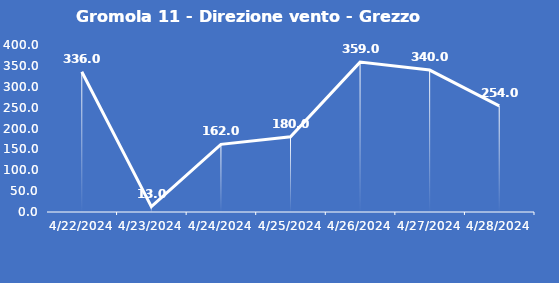
| Category | Gromola 11 - Direzione vento - Grezzo (°N) |
|---|---|
| 4/22/24 | 336 |
| 4/23/24 | 13 |
| 4/24/24 | 162 |
| 4/25/24 | 180 |
| 4/26/24 | 359 |
| 4/27/24 | 340 |
| 4/28/24 | 254 |